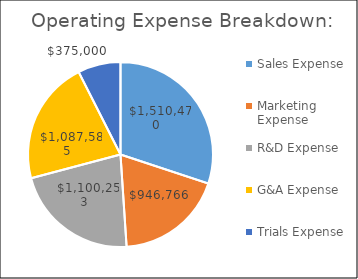
| Category | Series 1 |
|---|---|
| Sales Expense | 1510470.25 |
| Marketing Expense | 946765.75 |
| R&D Expense | 1100253.112 |
| G&A Expense | 1087584.95 |
| Trials Expense | 375000 |